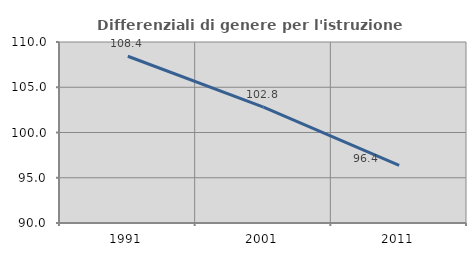
| Category | Differenziali di genere per l'istruzione superiore |
|---|---|
| 1991.0 | 108.423 |
| 2001.0 | 102.799 |
| 2011.0 | 96.366 |